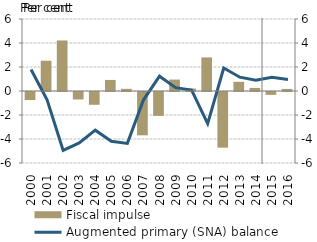
| Category | Fiscal impulse |
|---|---|
| 0 | -0.672 |
| 1900-01-01 | 2.524 |
| 1900-01-02 | 4.211 |
| 1900-01-03 | -0.622 |
| 1900-01-04 | -1.064 |
| 1900-01-05 | 0.922 |
| 1900-01-06 | 0.18 |
| 1900-01-07 | -3.61 |
| 1900-01-08 | -1.989 |
| 1900-01-09 | 0.952 |
| 1900-01-10 | 0.204 |
| 1900-01-11 | 2.798 |
| 1900-01-12 | -4.637 |
| 1900-01-13 | 0.765 |
| 1900-01-14 | 0.256 |
| 1900-01-15 | -0.24 |
| 1900-01-16 | 0.173 |